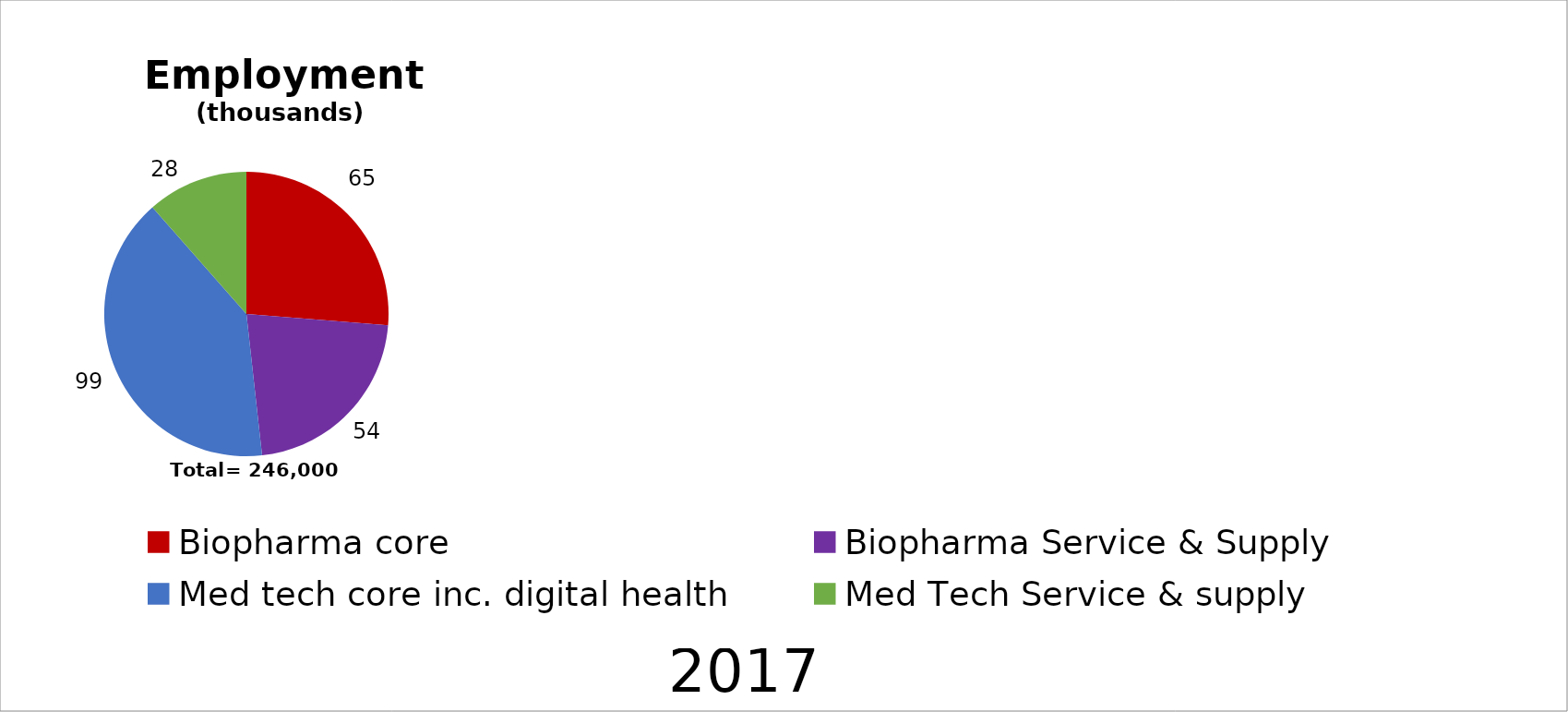
| Category | Series 0 |
|---|---|
| Biopharma core | 64.539 |
| Biopharma Service & Supply | 54.029 |
| Med tech core inc. digital health | 98.956 |
| Med Tech Service & supply | 28.246 |